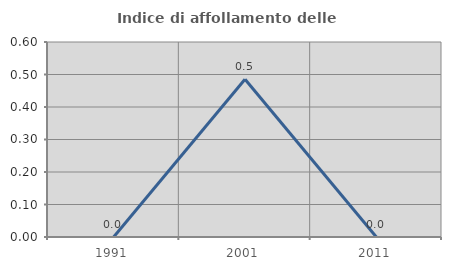
| Category | Indice di affollamento delle abitazioni  |
|---|---|
| 1991.0 | 0 |
| 2001.0 | 0.485 |
| 2011.0 | 0 |